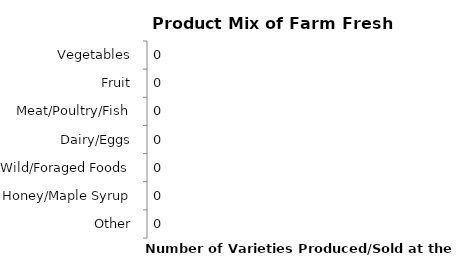
| Category | Series 0 |
|---|---|
| Vegetables | 0 |
| Fruit | 0 |
| Meat/Poultry/Fish | 0 |
| Dairy/Eggs | 0 |
| Wild/Foraged Foods | 0 |
| Honey/Maple Syrup | 0 |
| Other | 0 |